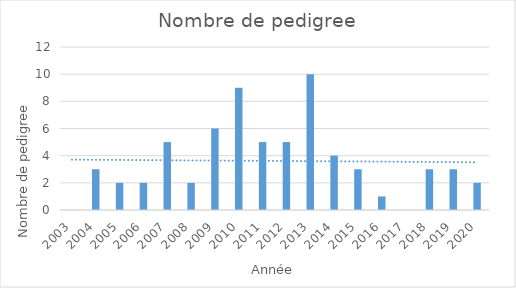
| Category | Series 0 |
|---|---|
| 2003.0 | 0 |
| 2004.0 | 3 |
| 2005.0 | 2 |
| 2006.0 | 2 |
| 2007.0 | 5 |
| 2008.0 | 2 |
| 2009.0 | 6 |
| 2010.0 | 9 |
| 2011.0 | 5 |
| 2012.0 | 5 |
| 2013.0 | 10 |
| 2014.0 | 4 |
| 2015.0 | 3 |
| 2016.0 | 1 |
| 2017.0 | 0 |
| 2018.0 | 3 |
| 2019.0 | 3 |
| 2020.0 | 2 |